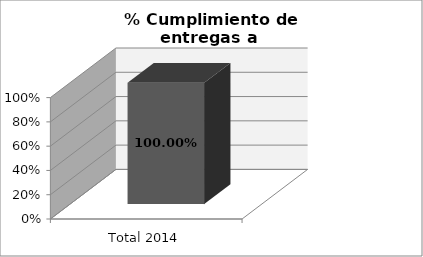
| Category | % |
|---|---|
| Total 2014 | 1 |